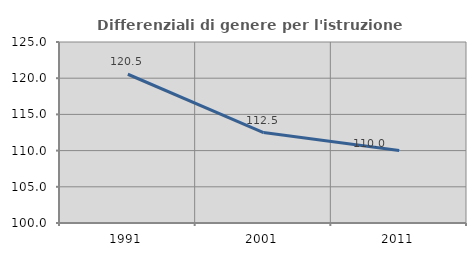
| Category | Differenziali di genere per l'istruzione superiore |
|---|---|
| 1991.0 | 120.545 |
| 2001.0 | 112.49 |
| 2011.0 | 110.028 |